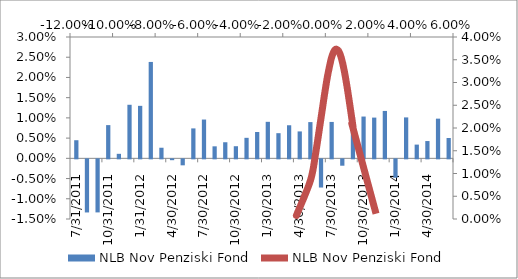
| Category | NLB Nov Penziski Fond |
|---|---|
| 31/07/2011 | 0.004 |
| 31/08/2011 | -0.013 |
| 30/09/2011 | -0.013 |
| 31/10/2011 | 0.008 |
| 30/11/2011 | 0.001 |
| 31/12/2011 | 0.013 |
| 31/01/2012 | 0.013 |
| 29/02/2012 | 0.024 |
| 31/03/2012 | 0.003 |
| 30/04/2012 | 0 |
| 31/05/2012 | -0.001 |
| 30/06/2012 | 0.007 |
| 31/07/2012 | 0.01 |
| 31/08/2012 | 0.003 |
| 30/09/2012 | 0.004 |
| 31/10/2012 | 0.003 |
| 30/11/2012 | 0.005 |
| 31/12/2012 | 0.007 |
| 31/01/2013 | 0.009 |
| 28/02/2013 | 0.006 |
| 31/03/2013 | 0.008 |
| 30/04/2013 | 0.007 |
| 31/05/2013 | 0.009 |
| 30/06/2013 | -0.007 |
| 31/07/2013 | 0.009 |
| 31/08/2013 | -0.002 |
| 30/09/2013 | 0.01 |
| 31/10/2013 | 0.01 |
| 30/11/2013 | 0.01 |
| 31/12/2013 | 0.012 |
| 31/01/2014 | -0.005 |
| 28/02/2014 | 0.01 |
| 31/03/2014 | 0.003 |
| 30/04/2014 | 0.004 |
| 31/05/2014 | 0.01 |
| 30/06/2014 | 0.005 |